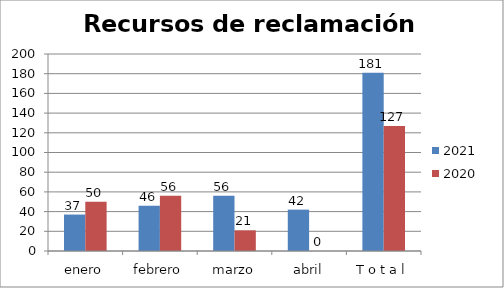
| Category | 2021 | 2020 |
|---|---|---|
| enero | 37 | 50 |
| febrero | 46 | 56 |
| marzo | 56 | 21 |
| abril | 42 | 0 |
| T o t a l | 181 | 127 |